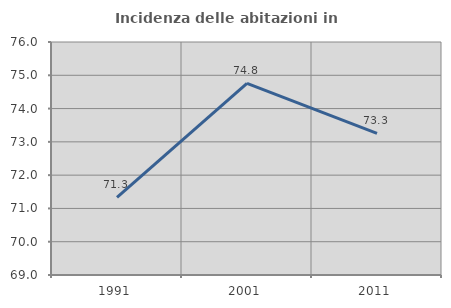
| Category | Incidenza delle abitazioni in proprietà  |
|---|---|
| 1991.0 | 71.331 |
| 2001.0 | 74.756 |
| 2011.0 | 73.256 |